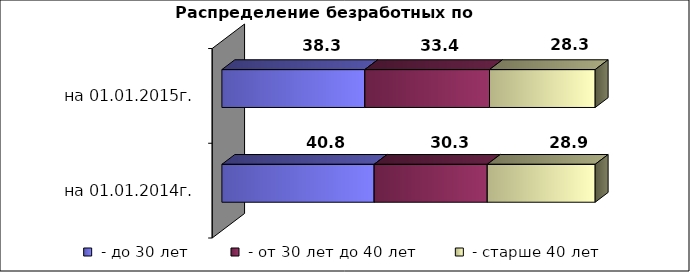
| Category |  - до 30 лет  |  - от 30 лет до 40 лет  |  - старше 40 лет  |
|---|---|---|---|
| на 01.01.2014г. | 40.8 | 30.3 | 28.9 |
| на 01.01.2015г. | 38.3 | 33.4 | 28.3 |